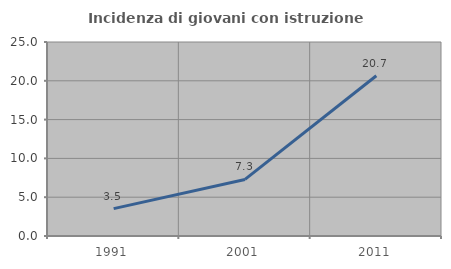
| Category | Incidenza di giovani con istruzione universitaria |
|---|---|
| 1991.0 | 3.529 |
| 2001.0 | 7.292 |
| 2011.0 | 20.652 |